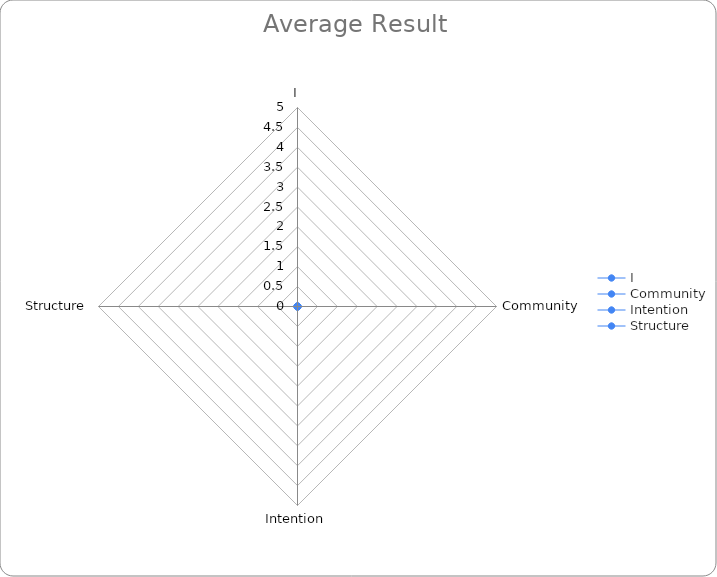
| Category | Series 0 |
|---|---|
| I | 0 |
| Community | 0 |
| Intention | 0 |
| Structure | 0 |